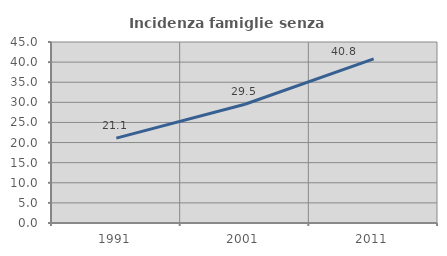
| Category | Incidenza famiglie senza nuclei |
|---|---|
| 1991.0 | 21.101 |
| 2001.0 | 29.517 |
| 2011.0 | 40.789 |